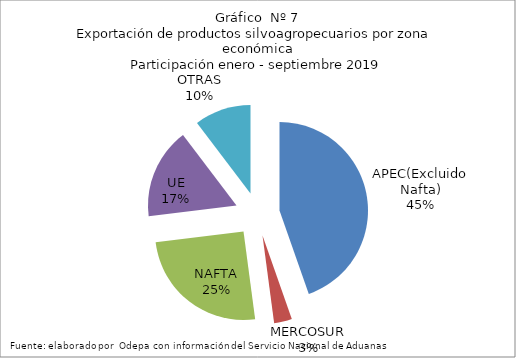
| Category | Series 0 |
|---|---|
| APEC(Excluido Nafta) | 5874504.376 |
| MERCOSUR | 430229.306 |
| NAFTA | 3311015.918 |
| UE | 2187907.161 |
| OTRAS | 1359814.238 |